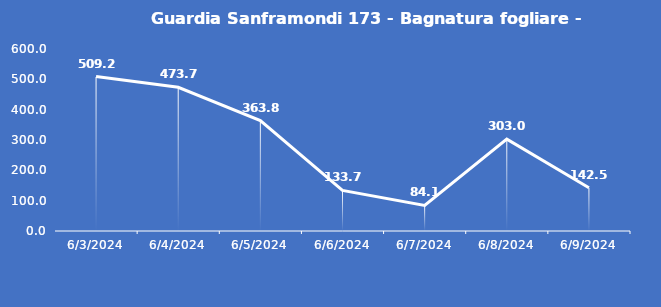
| Category | Guardia Sanframondi 173 - Bagnatura fogliare - Grezzo (min) |
|---|---|
| 6/3/24 | 509.2 |
| 6/4/24 | 473.7 |
| 6/5/24 | 363.8 |
| 6/6/24 | 133.7 |
| 6/7/24 | 84.1 |
| 6/8/24 | 303 |
| 6/9/24 | 142.5 |